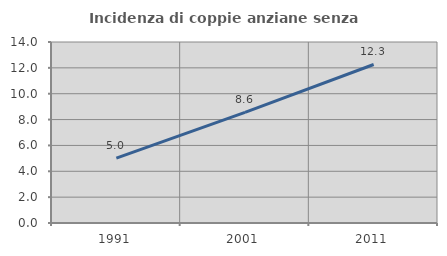
| Category | Incidenza di coppie anziane senza figli  |
|---|---|
| 1991.0 | 5.021 |
| 2001.0 | 8.554 |
| 2011.0 | 12.261 |